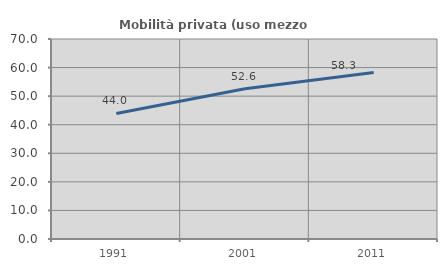
| Category | Mobilità privata (uso mezzo privato) |
|---|---|
| 1991.0 | 43.954 |
| 2001.0 | 52.557 |
| 2011.0 | 58.305 |